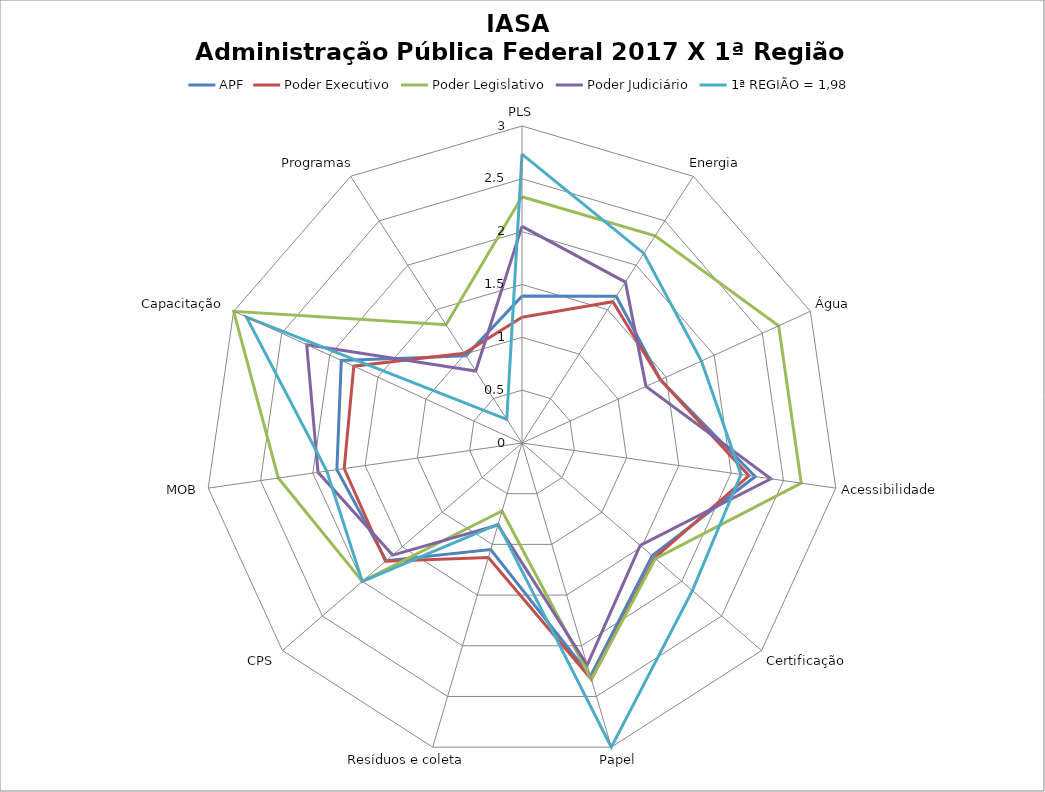
| Category | APF | Poder Executivo | Poder Legislativo | Poder Judiciário | 1ª REGIÃO = 1,98 |
|---|---|---|---|---|---|
| PLS | 1.39 | 1.19 | 2.33 | 2.05 | 2.733 |
| Energia | 1.65 | 1.59 | 2.33 | 1.81 | 2.133 |
| Água | 1.44 | 1.44 | 2.67 | 1.29 | 1.867 |
| Acessibilidade | 2.23 | 2.17 | 2.67 | 2.38 | 2.093 |
| Certificação | 1.63 | 1.66 | 1.67 | 1.48 | 2.133 |
| Papel | 2.3 | 2.33 | 2.33 | 2.19 | 3 |
| Resíduos e coleta | 1.05 | 1.13 | 0.67 | 0.81 | 0.8 |
| CPS | 1.7 | 1.71 | 2 | 1.62 | 2 |
| MOB | 1.77 | 1.7 | 2.33 | 1.95 | 1.867 |
| Capacitação | 1.88 | 1.75 | 3 | 2.24 | 2.867 |
| Programas | 0.98 | 1.01 | 1.33 | 0.81 | 0.267 |